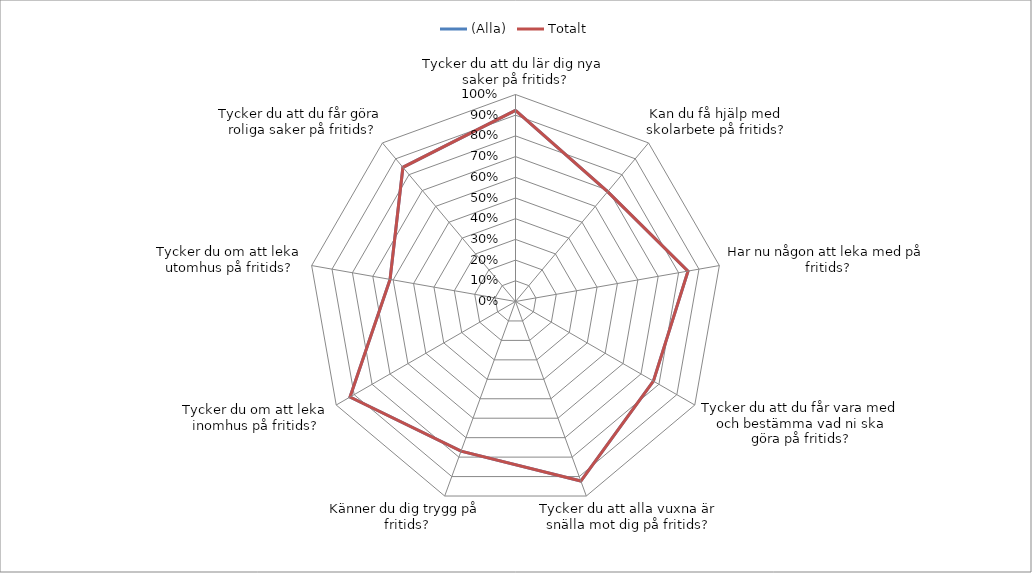
| Category | (Alla) | Totalt |
|---|---|---|
| Tycker du att du lär dig nya saker på fritids? | 0.923 | 0.923 |
| Kan du få hjälp med skolarbete på fritids? | 0.692 | 0.692 |
| Har nu någon att leka med på fritids? | 0.846 | 0.846 |
| Tycker du att du får vara med och bestämma vad ni ska göra på fritids? | 0.769 | 0.769 |
| Tycker du att alla vuxna är snälla mot dig på fritids? | 0.923 | 0.923 |
| Känner du dig trygg på fritids? | 0.769 | 0.769 |
| Tycker du om att leka inomhus på fritids? | 0.923 | 0.923 |
| Tycker du om att leka utomhus på fritids? | 0.615 | 0.615 |
| Tycker du att du får göra roliga saker på fritids? | 0.846 | 0.846 |